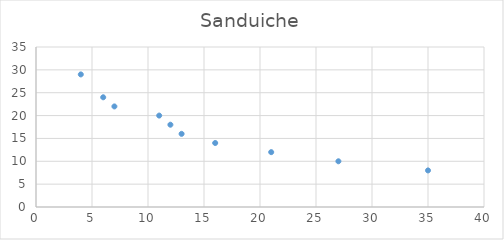
| Category | Sanduiche |
|---|---|
| 35.0 | 8 |
| 27.0 | 10 |
| 21.0 | 12 |
| 16.0 | 14 |
| 13.0 | 16 |
| 12.0 | 18 |
| 11.0 | 20 |
| 7.0 | 22 |
| 6.0 | 24 |
| 4.0 | 29 |